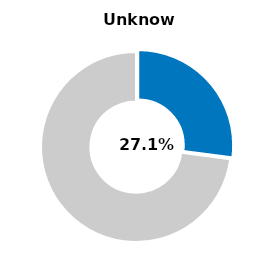
| Category | Series 0 |
|---|---|
| Unknown | 0.271 |
| Other | 0.729 |